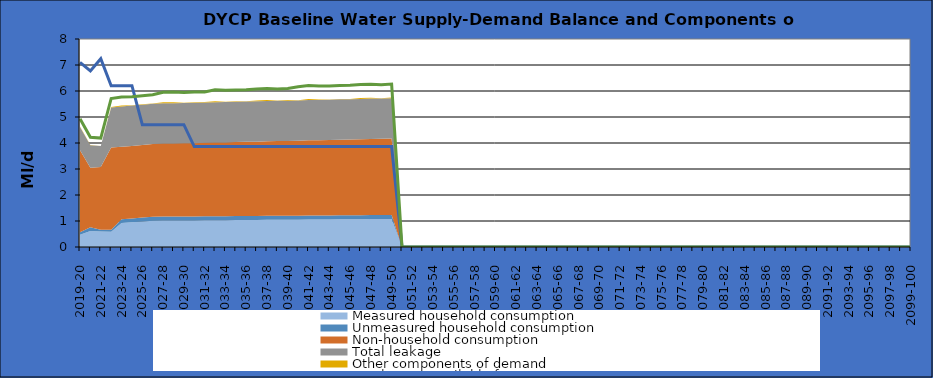
| Category | Total water available for use | Total demand + target headroom (baseline) |
|---|---|---|
| 0 | 7.1 | 4.93 |
| 1 | 6.77 | 4.22 |
| 2 | 7.24 | 4.188 |
| 3 | 6.204 | 5.712 |
| 4 | 6.204 | 5.77 |
| 5 | 6.204 | 5.781 |
| 6 | 4.704 | 5.817 |
| 7 | 4.704 | 5.853 |
| 8 | 4.704 | 5.954 |
| 9 | 4.704 | 5.96 |
| 10 | 4.704 | 5.941 |
| 11 | 3.864 | 5.962 |
| 12 | 3.864 | 5.963 |
| 13 | 3.864 | 6.044 |
| 14 | 3.864 | 6.025 |
| 15 | 3.864 | 6.041 |
| 16 | 3.864 | 6.047 |
| 17 | 3.864 | 6.078 |
| 18 | 3.864 | 6.094 |
| 19 | 3.864 | 6.075 |
| 20 | 3.864 | 6.096 |
| 21 | 3.864 | 6.167 |
| 22 | 3.864 | 6.208 |
| 23 | 3.864 | 6.189 |
| 24 | 3.864 | 6.195 |
| 25 | 3.864 | 6.211 |
| 26 | 3.864 | 6.217 |
| 27 | 3.864 | 6.248 |
| 28 | 3.864 | 6.264 |
| 29 | 3.864 | 6.245 |
| 30 | 3.864 | 6.266 |
| 31 | 0 | 0 |
| 32 | 0 | 0 |
| 33 | 0 | 0 |
| 34 | 0 | 0 |
| 35 | 0 | 0 |
| 36 | 0 | 0 |
| 37 | 0 | 0 |
| 38 | 0 | 0 |
| 39 | 0 | 0 |
| 40 | 0 | 0 |
| 41 | 0 | 0 |
| 42 | 0 | 0 |
| 43 | 0 | 0 |
| 44 | 0 | 0 |
| 45 | 0 | 0 |
| 46 | 0 | 0 |
| 47 | 0 | 0 |
| 48 | 0 | 0 |
| 49 | 0 | 0 |
| 50 | 0 | 0 |
| 51 | 0 | 0 |
| 52 | 0 | 0 |
| 53 | 0 | 0 |
| 54 | 0 | 0 |
| 55 | 0 | 0 |
| 56 | 0 | 0 |
| 57 | 0 | 0 |
| 58 | 0 | 0 |
| 59 | 0 | 0 |
| 60 | 0 | 0 |
| 61 | 0 | 0 |
| 62 | 0 | 0 |
| 63 | 0 | 0 |
| 64 | 0 | 0 |
| 65 | 0 | 0 |
| 66 | 0 | 0 |
| 67 | 0 | 0 |
| 68 | 0 | 0 |
| 69 | 0 | 0 |
| 70 | 0 | 0 |
| 71 | 0 | 0 |
| 72 | 0 | 0 |
| 73 | 0 | 0 |
| 74 | 0 | 0 |
| 75 | 0 | 0 |
| 76 | 0 | 0 |
| 77 | 0 | 0 |
| 78 | 0 | 0 |
| 79 | 0 | 0 |
| 80 | 0 | 0 |